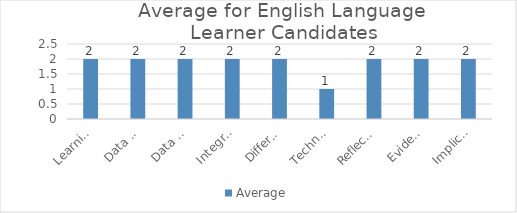
| Category | Average |
|---|---|
| Learning Goals Aligned with Pre-/Post-assessments ACEI 4.0 | 2 |
| Data Points | 2 |
| Data Analysis for Pedagogical Decisions ACEI 4.0 | 2 |
| Integrated Instruction ACEI 3.1 | 2 |
| Differentiation based on knowledge of individual learning ACEI 3.2 | 2 |
| Technology integration | 1 |
| Reflection on pedagogical decisions ACEI 1.0 | 2 |
| Evidence of impact on student learning ACEI 5.1 | 2 |
| Implications for teaching and professional development ACEI 5.1 | 2 |